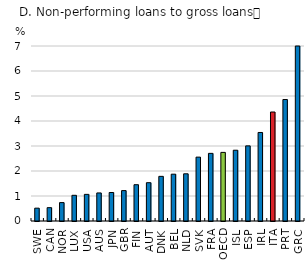
| Category | Non-performing Loans to Total Gross Loans, Percent |
|---|---|
| SWE | 0.513 |
| CAN | 0.533 |
| NOR | 0.736 |
| LUX | 1.028 |
| USA | 1.065 |
| AUS | 1.122 |
| JPN | 1.14 |
| GBR | 1.216 |
| FIN | 1.452 |
| AUT | 1.532 |
| DNK | 1.786 |
| BEL | 1.873 |
| NLD | 1.888 |
| SVK | 2.555 |
| FRA | 2.705 |
| OECD | 2.744 |
| ISL | 2.831 |
| ESP | 3.006 |
| IRL | 3.541 |
| ITA | 4.36 |
| PRT | 4.859 |
| GRC | 26.978 |